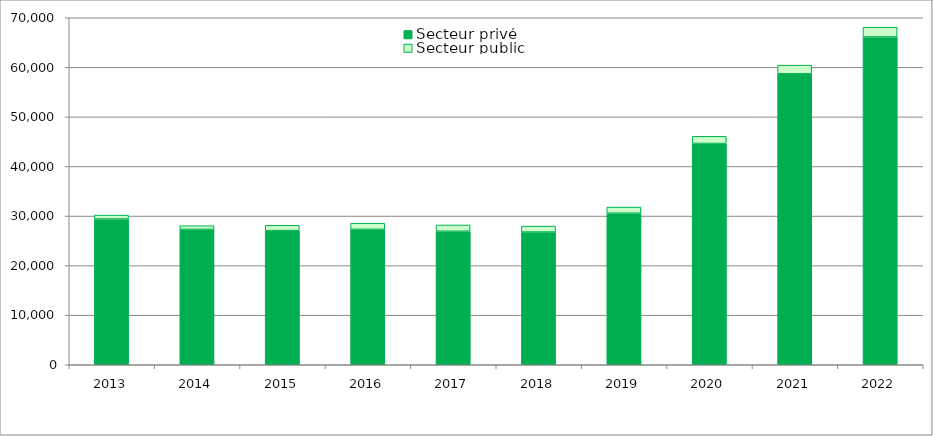
| Category | Secteur privé | Secteur public |
|---|---|---|
| 2013.0 | 29398 | 793 |
| 2014.0 | 27315 | 732 |
| 2015.0 | 27065 | 1070 |
| 2016.0 | 27313 | 1240 |
| 2017.0 | 26928 | 1270 |
| 2018.0 | 26772 | 1201 |
| 2019.0 | 30576 | 1232 |
| 2020.0 | 44638 | 1443 |
| 2021.0 | 58683 | 1754 |
| 2022.0 | 66127 | 1969 |